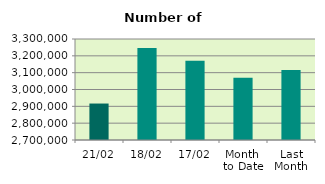
| Category | Series 0 |
|---|---|
| 21/02 | 2916634 |
| 18/02 | 3246536 |
| 17/02 | 3170078 |
| Month 
to Date | 3070170 |
| Last
Month | 3115708.381 |